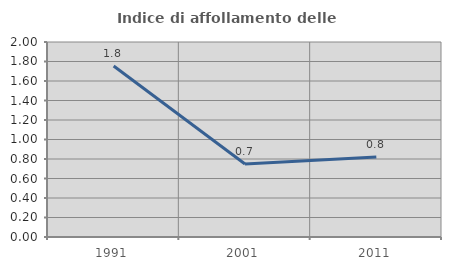
| Category | Indice di affollamento delle abitazioni  |
|---|---|
| 1991.0 | 1.753 |
| 2001.0 | 0.748 |
| 2011.0 | 0.819 |